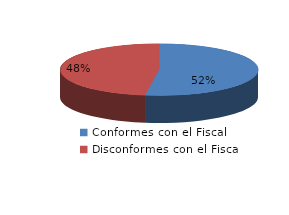
| Category | Series 0 |
|---|---|
| 0 | 555 |
| 1 | 508 |